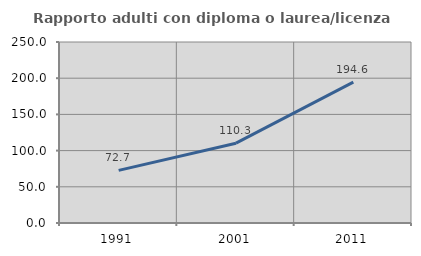
| Category | Rapporto adulti con diploma o laurea/licenza media  |
|---|---|
| 1991.0 | 72.692 |
| 2001.0 | 110.251 |
| 2011.0 | 194.578 |